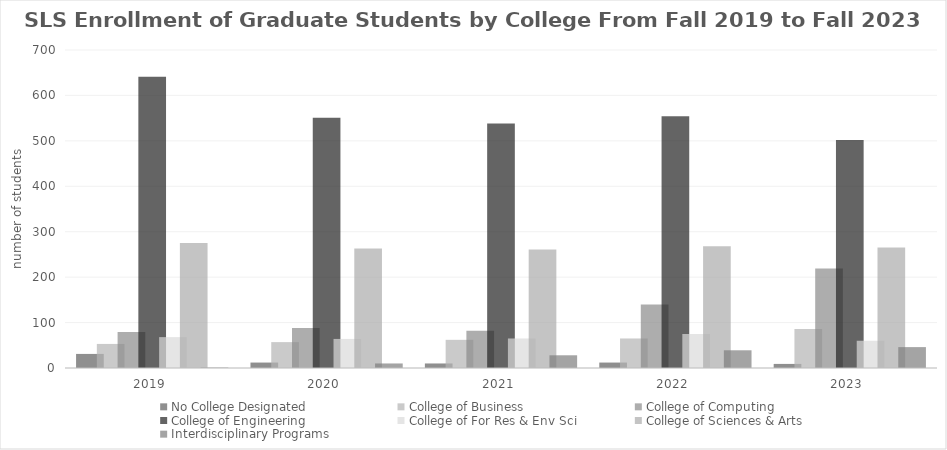
| Category | No College Designated | College of Business | College of Computing | College of Engineering | College of For Res & Env Sci | College of Sciences & Arts | Interdisciplinary Programs |
|---|---|---|---|---|---|---|---|
| 2019  | 31 | 53 | 79 | 641 | 68 | 275 | 1 |
| 2020  | 12 | 57 | 88 | 551 | 64 | 263 | 10 |
| 2021  | 10 | 62 | 82 | 538 | 65 | 261 | 28 |
| 2022  | 12 | 65 | 140 | 554 | 75 | 268 | 39 |
| 2023  | 9 | 86 | 219 | 502 | 60 | 265 | 46 |